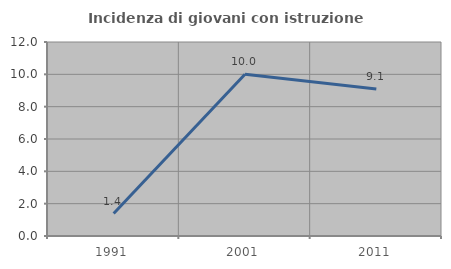
| Category | Incidenza di giovani con istruzione universitaria |
|---|---|
| 1991.0 | 1.389 |
| 2001.0 | 10 |
| 2011.0 | 9.091 |